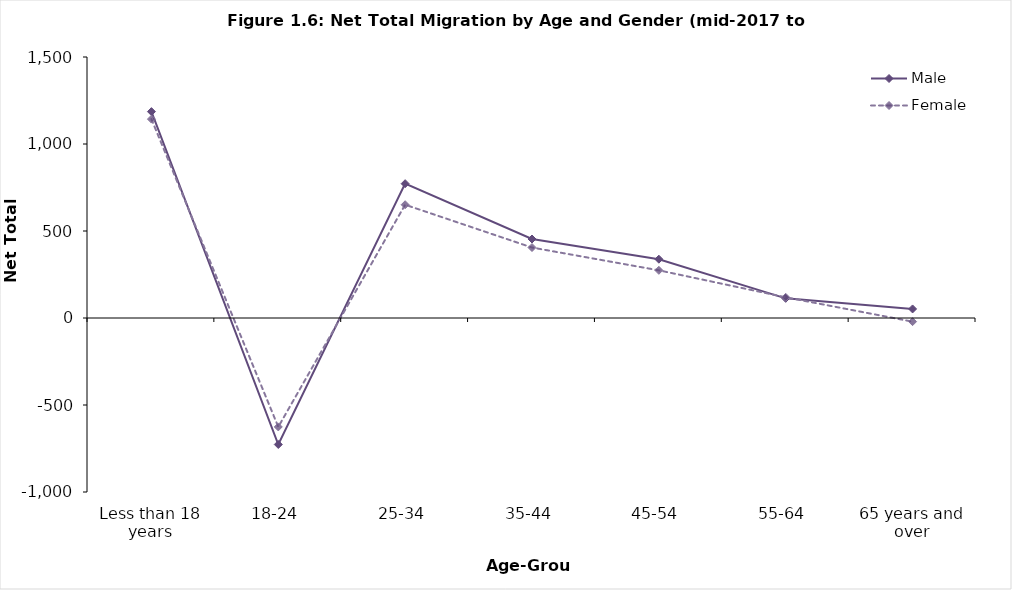
| Category | Male | Female |
|---|---|---|
| Less than 18 years | 1186 | 1143 |
| 18-24 | -727 | -626 |
| 25-34 | 772 | 651 |
| 35-44 | 454 | 405 |
| 45-54 | 338 | 274 |
| 55-64 | 113 | 119 |
| 65 years and over | 52 | -21 |